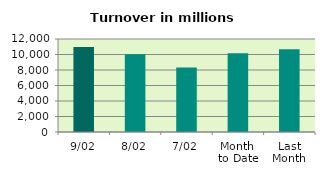
| Category | Series 0 |
|---|---|
| 9/02 | 10953.301 |
| 8/02 | 10020.347 |
| 7/02 | 8306.693 |
| Month 
to Date | 10153.019 |
| Last
Month | 10672.471 |